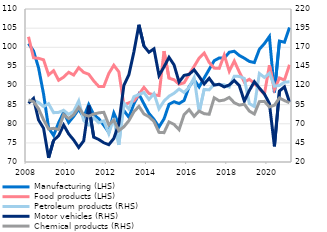
| Category | Manufacturing (LHS) | Food products (LHS) |
|---|---|---|
| 2008 | 100.969 | 102.741 |
| II | 99.031 | 97.259 |
| III | 94.635 | 97.109 |
| IV | 87.766 | 96.715 |
| 2009 | 78.923 | 92.764 |
| II | 76.927 | 93.876 |
| III | 80.273 | 91.367 |
| IV | 82.995 | 92.186 |
| 2010 | 80.321 | 93.462 |
| II | 81.929 | 92.737 |
| III | 83.822 | 94.65 |
| IV | 81.702 | 93.434 |
| 2011 | 85.031 | 92.939 |
| II | 82.353 | 91.191 |
| III | 81.307 | 89.747 |
| IV | 79.595 | 89.752 |
| 2012 | 77.737 | 93.154 |
| II | 82.81 | 95.294 |
| III | 79.836 | 93.556 |
| IV | 83.455 | 84.956 |
| 2013 | 81.697 | 85.466 |
| II | 85.208 | 85.966 |
| III | 87.729 | 87.693 |
| IV | 85.199 | 89.509 |
| 2014 | 82.71 | 87.919 |
| II | 81.127 | 87.555 |
| III | 79.166 | 87.381 |
| IV | 81.263 | 98.993 |
| 2015 | 85.102 | 91.914 |
| II | 85.756 | 91.502 |
| III | 85.287 | 90.314 |
| IV | 86.087 | 90.709 |
| 2016 | 89.694 | 92.906 |
| II | 91.518 | 94.986 |
| III | 89.623 | 97.172 |
| IV | 91.945 | 98.494 |
| 2017 | 94.228 | 96.032 |
| II | 96.483 | 94.548 |
| III | 97.201 | 94.479 |
| IV | 97.131 | 97.956 |
| 2018 | 98.696 | 93.722 |
| II | 98.953 | 96.403 |
| III | 97.861 | 93.539 |
| IV | 97.135 | 90.876 |
| 2019 | 96.293 | 91.63 |
| II | 95.999 | 90.541 |
| III | 99.472 | 89.031 |
| IV | 100.947 | 87.728 |
| 2020 | 102.797 | 95.288 |
| II | 88.178 | 88.984 |
| III | 101.606 | 91.978 |
| IV | 101.309 | 91.42 |
| 2021 | 105.153 | 95.422 |